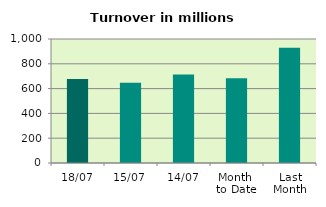
| Category | Series 0 |
|---|---|
| 18/07 | 678.242 |
| 15/07 | 647.489 |
| 14/07 | 714.565 |
| Month 
to Date | 683.153 |
| Last
Month | 929.439 |